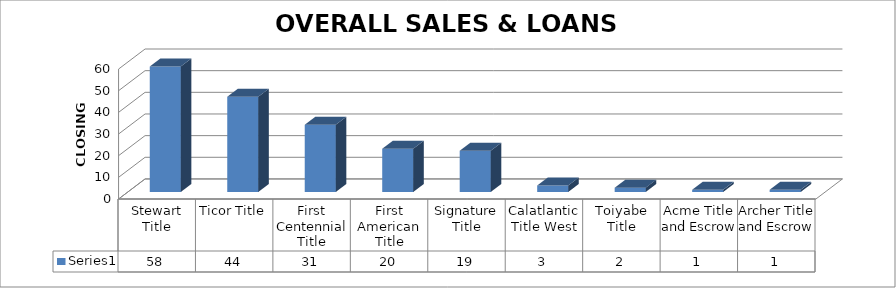
| Category | Series 0 |
|---|---|
| Stewart Title | 58 |
| Ticor Title | 44 |
| First Centennial Title | 31 |
| First American Title | 20 |
| Signature Title | 19 |
| Calatlantic Title West | 3 |
| Toiyabe Title | 2 |
| Acme Title and Escrow | 1 |
| Archer Title and Escrow | 1 |